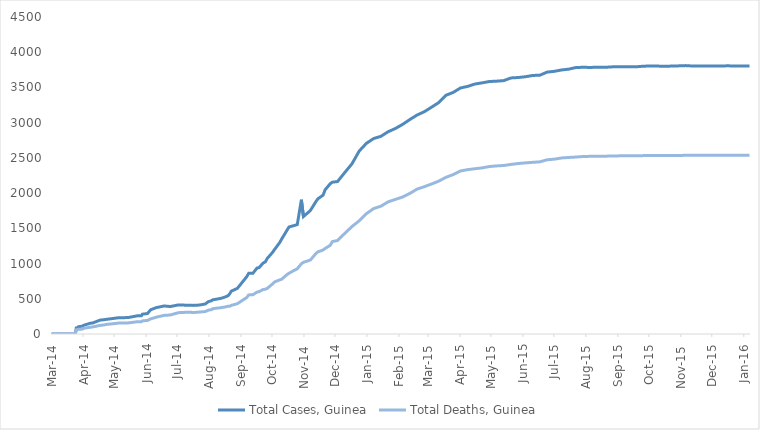
| Category | Total Cases, Guinea | Total Deaths, Guinea |
|---|---|---|
| 2014-03-01 | 0 | 0 |
| 2014-03-02 | 0 | 0 |
| 2014-03-03 | 0 | 0 |
| 2014-03-04 | 0 | 0 |
| 2014-03-05 | 0 | 0 |
| 2014-03-06 | 0 | 0 |
| 2014-03-07 | 0 | 0 |
| 2014-03-08 | 0 | 0 |
| 2014-03-09 | 0 | 0 |
| 2014-03-10 | 0 | 0 |
| 2014-03-11 | 0 | 0 |
| 2014-03-12 | 0 | 0 |
| 2014-03-13 | 0 | 0 |
| 2014-03-14 | 0 | 0 |
| 2014-03-15 | 0 | 0 |
| 2014-03-16 | 0 | 0 |
| 2014-03-17 | 0 | 0 |
| 2014-03-18 | 0 | 0 |
| 2014-03-19 | 0 | 0 |
| 2014-03-20 | 0 | 0 |
| 2014-03-21 | 0 | 0 |
| 2014-03-22 | 0 | 0 |
| 2014-03-23 | 0 | 0 |
| 2014-03-24 | 0 | 0 |
| 2014-03-25 | 86 | 59 |
| 2014-03-26 | 86 | 60 |
| 2014-03-27 | 103 | 66 |
| 2014-03-31 | 112 | 70 |
| 2014-04-01 | 122 | 80 |
| 2014-04-02 | 127 | 83 |
| 2014-04-07 | 151 | 95 |
| 2014-04-10 | 157 | 101 |
| 2014-04-17 | 197 | 122 |
| 2014-04-21 | 203 | 129 |
| 2014-04-23 | 208 | 136 |
| 2014-04-30 | 221 | 146 |
| 2014-05-05 | 231 | 155 |
| 2014-05-14 | 233 | 157 |
| 2014-05-23 | 258 | 174 |
| 2014-05-27 | 258 | 174 |
| 2014-05-28 | 281 | 186 |
| 2014-06-02 | 291 | 193 |
| 2014-06-05 | 344 | 215 |
| 2014-06-10 | 372 | 236 |
| 2014-06-11 | 376 | 241 |
| 2014-06-18 | 398 | 264 |
| 2014-06-24 | 390 | 270 |
| 2014-07-02 | 413 | 303 |
| 2014-07-07 | 412 | 305 |
| 2014-07-08 | 408 | 307 |
| 2014-07-14 | 409 | 309 |
| 2014-07-16 | 406 | 304 |
| 2014-07-21 | 410 | 310 |
| 2014-07-24 | 415 | 314 |
| 2014-07-28 | 427 | 319 |
| 2014-07-31 | 460 | 339 |
| 2014-08-03 | 472 | 346 |
| 2014-08-04 | 485 | 358 |
| 2014-08-08 | 495 | 367 |
| 2014-08-12 | 506 | 373 |
| 2014-08-13 | 510 | 377 |
| 2014-08-15 | 519 | 380 |
| 2014-08-19 | 543 | 394 |
| 2014-08-21 | 579 | 396 |
| 2014-08-22 | 607 | 406 |
| 2014-08-28 | 648 | 430 |
| 2014-09-06 | 812 | 517 |
| 2014-09-08 | 862 | 555 |
| 2014-09-12 | 861 | 557 |
| 2014-09-16 | 936 | 595 |
| 2014-09-18 | 942 | 601 |
| 2014-09-22 | 1008 | 632 |
| 2014-09-24 | 1022 | 635 |
| 2014-09-26 | 1074 | 648 |
| 2014-10-01 | 1157 | 710 |
| 2014-10-03 | 1199 | 739 |
| 2014-10-08 | 1298 | 768 |
| 2014-10-10 | 1350 | 778 |
| 2014-10-15 | 1472 | 843 |
| 2014-10-17 | 1519 | 862 |
| 2014-10-22 | 1540 | 904 |
| 2014-10-25 | 1553 | 926 |
| 2014-10-29 | 1906 | 997 |
| 2014-10-31 | 1667 | 1018 |
| 2014-11-05 | 1731 | 1041 |
| 2014-11-07 | 1760 | 1054 |
| 2014-11-12 | 1878 | 1142 |
| 2014-11-14 | 1919 | 1166 |
| 2014-11-19 | 1971 | 1192 |
| 2014-11-21 | 2047 | 1214 |
| 2014-11-26 | 2134 | 1260 |
| 2014-11-28 | 2155 | 1312 |
| 2014-12-03 | 2164 | 1327 |
| 2014-12-10 | 2292 | 1428 |
| 2014-12-17 | 2416 | 1525 |
| 2014-12-24 | 2597 | 1607 |
| 2014-12-31 | 2707 | 1708 |
| 2015-01-07 | 2775 | 1781 |
| 2015-01-14 | 2806 | 1814 |
| 2015-01-21 | 2871 | 1876 |
| 2015-01-28 | 2917 | 1910 |
| 2015-02-04 | 2975 | 1944 |
| 2015-02-11 | 3044 | 1995 |
| 2015-02-18 | 3108 | 2057 |
| 2015-02-25 | 3155 | 2091 |
| 2015-03-04 | 3219 | 2129 |
| 2015-03-11 | 3285 | 2170 |
| 2015-03-18 | 3389 | 2224 |
| 2015-03-25 | 3429 | 2263 |
| 2015-04-01 | 3492 | 2314 |
| 2015-04-08 | 3515 | 2333 |
| 2015-04-15 | 3548 | 2346 |
| 2015-04-22 | 3565 | 2358 |
| 2015-04-29 | 3584 | 2377 |
| 2015-05-06 | 3589 | 2386 |
| 2015-05-13 | 3597 | 2392 |
| 2015-05-20 | 3635 | 2407 |
| 2015-05-27 | 3641 | 2420 |
| 2015-06-03 | 3652 | 2429 |
| 2015-06-10 | 3670 | 2437 |
| 2015-06-17 | 3674 | 2444 |
| 2015-06-24 | 3718 | 2473 |
| 2015-07-01 | 3729 | 2482 |
| 2015-07-08 | 3748 | 2499 |
| 2015-07-15 | 3760 | 2506 |
| 2015-07-22 | 3783 | 2512 |
| 2015-07-29 | 3786 | 2520 |
| 2015-08-05 | 3784 | 2522 |
| 2015-08-12 | 3787 | 2524 |
| 2015-08-19 | 3786 | 2524 |
| 2015-08-26 | 3792 | 2527 |
| 2015-09-03 | 3792 | 2529 |
| 2015-09-10 | 3792 | 2530 |
| 2015-09-17 | 3792 | 2530 |
| 2015-09-24 | 3800 | 2532 |
| 2015-10-01 | 3805 | 2533 |
| 2015-10-08 | 3804 | 2534 |
| 2015-10-15 | 3800 | 2534 |
| 2015-10-22 | 3803 | 2535 |
| 2015-10-29 | 3806 | 2535 |
| 2015-11-05 | 3810 | 2536 |
| 2015-11-11 | 3805 | 2536 |
| 2015-11-18 | 3804 | 2536 |
| 2015-11-25 | 3804 | 2536 |
| 2015-12-02 | 3804 | 2536 |
| 2015-12-09 | 3804 | 2536 |
| 2015-12-16 | 3807 | 2536 |
| 2015-12-23 | 3804 | 2536 |
| 2015-12-30 | 3804 | 2536 |
| 2016-01-06 | 3804 | 2536 |